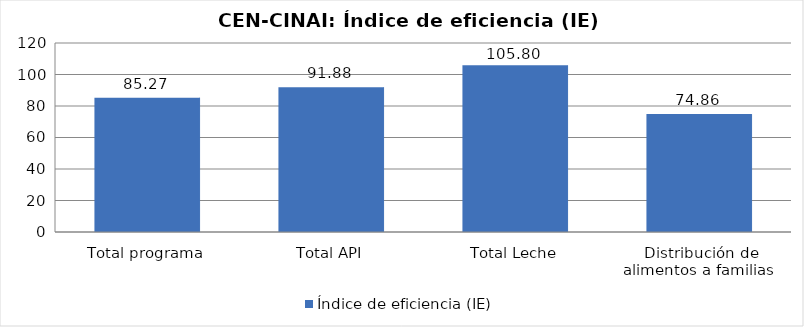
| Category | Índice de eficiencia (IE)  |
|---|---|
| Total programa | 85.266 |
| Total API | 91.878 |
| Total Leche | 105.805 |
| Distribución de alimentos a familias  | 74.865 |